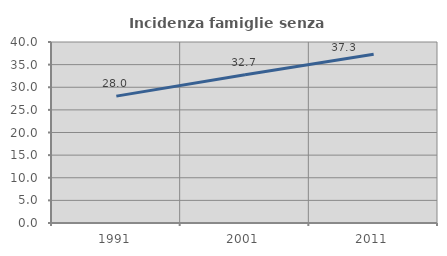
| Category | Incidenza famiglie senza nuclei |
|---|---|
| 1991.0 | 28.037 |
| 2001.0 | 32.743 |
| 2011.0 | 37.273 |